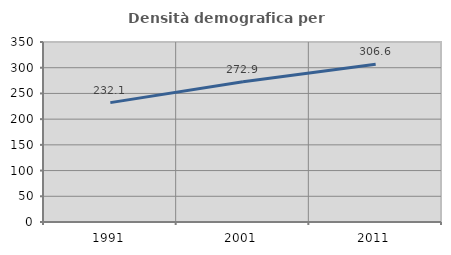
| Category | Densità demografica |
|---|---|
| 1991.0 | 232.118 |
| 2001.0 | 272.891 |
| 2011.0 | 306.601 |